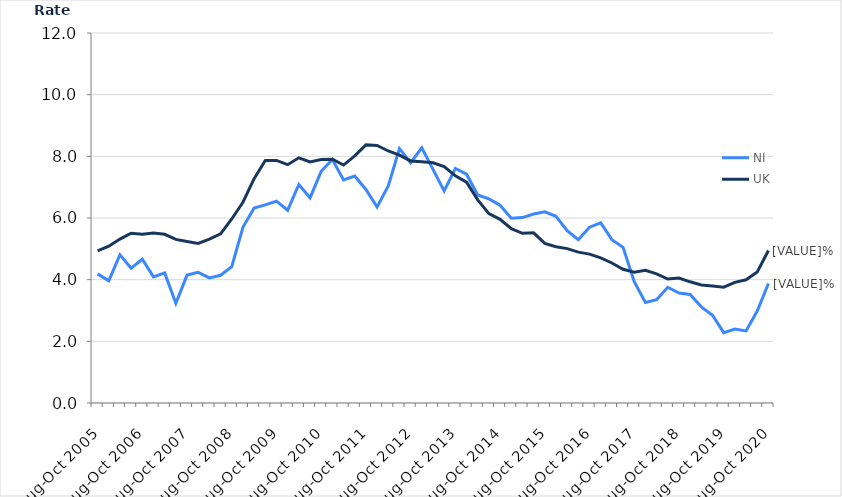
| Category | NI | UK |
|---|---|---|
| Aug-Oct 2005 | 4.188 | 4.932 |
| Nov-Jan 2006 | 3.962 | 5.087 |
| Feb-Apr 2006 | 4.807 | 5.316 |
| May-Jul 2006 | 4.372 | 5.506 |
| Aug-Oct 2006 | 4.661 | 5.476 |
| Nov-Jan 2007 | 4.09 | 5.51 |
| Feb-Apr 2007 | 4.22 | 5.472 |
| May-Jul 2007 | 3.233 | 5.306 |
| Aug-Oct 2007 | 4.148 | 5.239 |
| Nov-Jan 2008 | 4.239 | 5.177 |
| Feb-Apr 2008 | 4.056 | 5.314 |
| May-Jul 2008 | 4.143 | 5.487 |
| Aug-Oct 2008 | 4.424 | 5.968 |
| Nov-Jan 2009 | 5.7 | 6.511 |
| Feb-Apr 2009 | 6.323 | 7.274 |
| May-Jul 2009 | 6.424 | 7.868 |
| Aug-Oct 2009 | 6.545 | 7.868 |
| Nov-Jan 2010 | 6.251 | 7.729 |
| Feb-Apr 2010 | 7.087 | 7.952 |
| May-Jul 2010 | 6.654 | 7.82 |
| Aug-Oct 2010 | 7.514 | 7.897 |
| Nov-Jan 2011 | 7.898 | 7.909 |
| Feb-Apr 2011 | 7.236 | 7.717 |
| May-Jul 2011 | 7.361 | 8.013 |
| Aug-Oct 2011 | 6.925 | 8.372 |
| Nov-Jan 2012 | 6.356 | 8.352 |
| Feb-Apr 2012 | 7.038 | 8.174 |
| May-Jul 2012 | 8.249 | 8.038 |
| Aug-Oct 2012 | 7.794 | 7.852 |
| Nov-Jan 2013 | 8.276 | 7.822 |
| Feb-Apr 2013 | 7.576 | 7.792 |
| May-Jul 2013 | 6.879 | 7.671 |
| Aug-Oct 2013 | 7.607 | 7.369 |
| Nov-Jan 2014 | 7.42 | 7.162 |
| Feb-Apr 2014 | 6.746 | 6.588 |
| May-Jul 2014 | 6.618 | 6.143 |
| Aug-Oct 2014 | 6.416 | 5.955 |
| Nov-Jan 2015 | 5.994 | 5.655 |
| Feb-Apr 2015 | 6.014 | 5.504 |
| May-Jul 2015 | 6.128 | 5.519 |
| Aug-Oct 2015 | 6.2 | 5.174 |
| Nov-Jan 2016 | 6.056 | 5.069 |
| Feb-Apr 2016 | 5.592 | 5.007 |
| May-Jul 2016 | 5.294 | 4.894 |
| Aug-Oct 2016 | 5.703 | 4.829 |
| Nov-Jan 2017 | 5.845 | 4.707 |
| Feb-Apr 2017 | 5.298 | 4.54 |
| May-Jul 2017 | 5.048 | 4.338 |
| Aug-Oct 2017 | 3.937 | 4.243 |
| Nov-Jan 2018 | 3.262 | 4.306 |
| Feb-Apr 2018 | 3.349 | 4.189 |
| May-Jul 2018 | 3.754 | 4.021 |
| Aug-Oct 2018 | 3.564 | 4.055 |
| Nov-Jan 2019 | 3.521 | 3.931 |
| Feb-Apr 2019 | 3.119 | 3.83 |
| May-Jul 2019 | 2.844 | 3.797 |
| Aug-Oct 2019 | 2.281 | 3.757 |
| Nov-Jan 2020 | 2.398 | 3.913 |
| Feb-Apr 2020 | 2.339 | 3.995 |
| May-Jul 2020 | 2.983 | 4.253 |
| Aug-Oct 2020 | 3.876 | 4.944 |